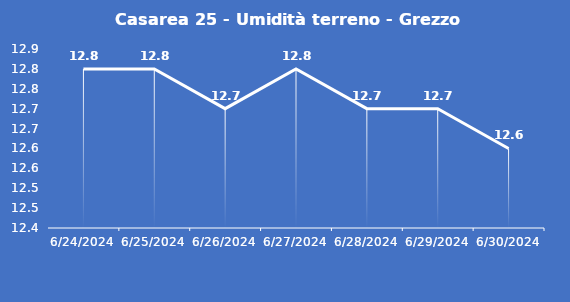
| Category | Casarea 25 - Umidità terreno - Grezzo (%VWC) |
|---|---|
| 6/24/24 | 12.8 |
| 6/25/24 | 12.8 |
| 6/26/24 | 12.7 |
| 6/27/24 | 12.8 |
| 6/28/24 | 12.7 |
| 6/29/24 | 12.7 |
| 6/30/24 | 12.6 |